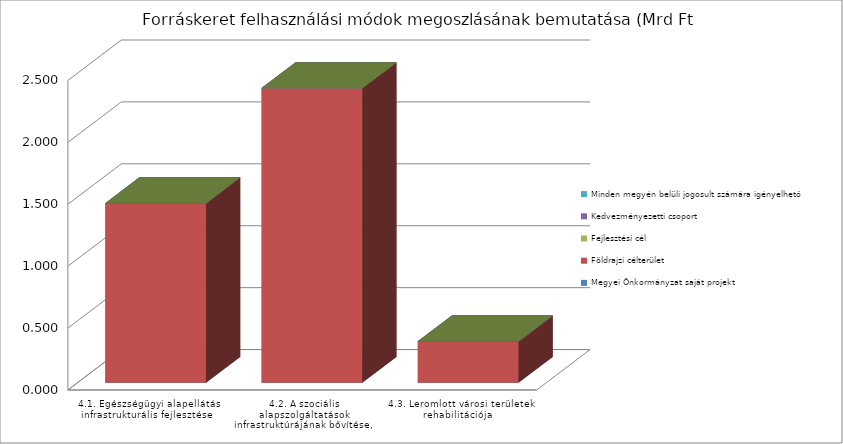
| Category | Megyei Önkormányzat saját projekt | Földrajzi célterület  | Fejlesztési cél  | Kedvezményezetti csoport | Minden megyén belüli jogosult számára igényelhető |
|---|---|---|---|---|---|
|  4.1. Egészségügyi alapellátás infrastrukturális fejlesztése  | 0 | 1.449 | 0 | 0 | 0 |
|  4.2. A szociális alapszolgáltatások infrastruktúrájának bővítése, fejlesztése  | 0 | 2.378 | 0 | 0 | 0 |
|  4.3. Leromlott városi területek rehabilitációja  | 0 | 0.333 | 0 | 0 | 0 |